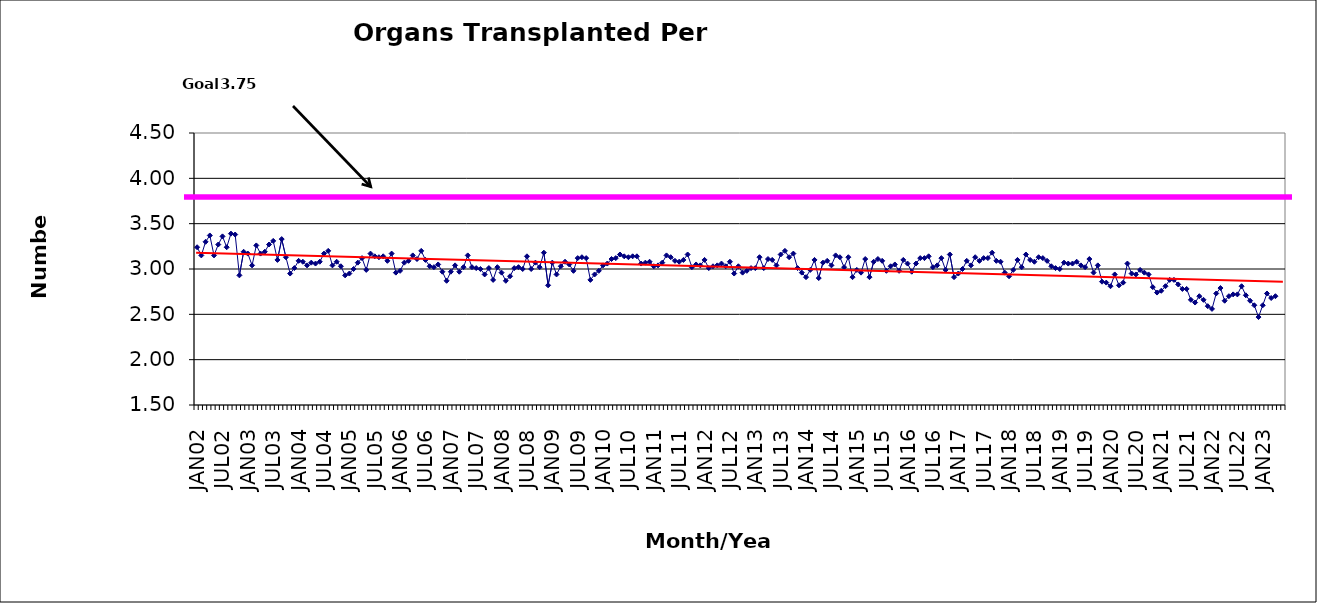
| Category | Series 0 |
|---|---|
| JAN02 | 3.24 |
| FEB02 | 3.15 |
| MAR02 | 3.3 |
| APR02 | 3.37 |
| MAY02 | 3.15 |
| JUN02 | 3.27 |
| JUL02 | 3.36 |
| AUG02 | 3.24 |
| SEP02 | 3.39 |
| OCT02 | 3.38 |
| NOV02 | 2.93 |
| DEC02 | 3.19 |
| JAN03 | 3.17 |
| FEB03 | 3.04 |
| MAR03 | 3.26 |
| APR03 | 3.17 |
| MAY03 | 3.19 |
| JUN03 | 3.27 |
| JUL03 | 3.31 |
| AUG03 | 3.1 |
| SEP03 | 3.33 |
| OCT03 | 3.13 |
| NOV03 | 2.95 |
| DEC03 | 3.01 |
| JAN04 | 3.09 |
| FEB04 | 3.08 |
| MAR04 | 3.04 |
| APR04 | 3.07 |
| MAY04 | 3.06 |
| JUN04 | 3.08 |
| JUL04 | 3.17 |
| AUG04 | 3.2 |
| SEP04 | 3.04 |
| OCT04 | 3.08 |
| NOV04 | 3.03 |
| DEC04 | 2.93 |
| JAN05 | 2.95 |
| FEB05 | 3 |
| MAR05 | 3.07 |
| APR05 | 3.12 |
| MAY05 | 2.99 |
| JUN05 | 3.17 |
| JUL05 | 3.14 |
| AUG05 | 3.13 |
| SEP05 | 3.14 |
| OCT05 | 3.09 |
| NOV05 | 3.17 |
| DEC05 | 2.96 |
| JAN06 | 2.98 |
| FEB06 | 3.07 |
| MAR06 | 3.09 |
| APR06 | 3.15 |
| MAY06 | 3.11 |
| JUN06 | 3.2 |
| JUL06 | 3.1 |
| AUG06 | 3.03 |
| SEP06 | 3.02 |
| OCT06 | 3.05 |
| NOV06 | 2.97 |
| DEC06 | 2.87 |
| JAN07 | 2.97 |
| FEB07 | 3.04 |
| MAR07 | 2.97 |
| APR07 | 3.02 |
| MAY07 | 3.15 |
| JUN07 | 3.02 |
| JUL07 | 3.01 |
| AUG07 | 3 |
| SEP07 | 2.94 |
| OCT07 | 3.01 |
| NOV07 | 2.88 |
| DEC07 | 3.02 |
| JAN08 | 2.96 |
| FEB08 | 2.87 |
| MAR08 | 2.92 |
| APR08 | 3.01 |
| MAY08 | 3.02 |
| JUN08 | 3 |
| JUL08 | 3.14 |
| AUG08 | 3 |
| SEP08 | 3.07 |
| OCT08 | 3.02 |
| NOV08 | 3.18 |
| DEC08 | 2.82 |
| JAN09 | 3.07 |
| FEB09 | 2.94 |
| MAR09 | 3.03 |
| APR09 | 3.08 |
| MAY09 | 3.05 |
| JUN09 | 2.98 |
| JUL09 | 3.12 |
| AUG09 | 3.13 |
| SEP09 | 3.12 |
| OCT09 | 2.88 |
| NOV09 | 2.94 |
| DEC09 | 2.98 |
| JAN10 | 3.04 |
| FEB10 | 3.06 |
| MAR10 | 3.11 |
| APR10 | 3.12 |
| MAY10 | 3.16 |
| JUN10 | 3.14 |
| JUL10 | 3.13 |
| AUG10 | 3.14 |
| SEP10 | 3.14 |
| OCT10 | 3.06 |
| NOV10 | 3.07 |
| DEC10 | 3.08 |
| JAN11 | 3.03 |
| FEB11 | 3.04 |
| MAR11 | 3.07 |
| APR11 | 3.15 |
| MAY11 | 3.13 |
| JUN11 | 3.09 |
| JUL11 | 3.08 |
| AUG11 | 3.1 |
| SEP11 | 3.16 |
| OCT11 | 3.02 |
| NOV11 | 3.05 |
| DEC11 | 3.04 |
| JAN12 | 3.1 |
| FEB12 | 3.01 |
| MAR12 | 3.03 |
| APR12 | 3.04 |
| MAY12 | 3.06 |
| JUN12 | 3.03 |
| JUL12 | 3.08 |
| AUG12 | 2.95 |
| SEP12 | 3.03 |
| OCT12 | 2.96 |
| NOV12 | 2.98 |
| DEC12 | 3.01 |
| JAN13 | 3.01 |
| FEB13 | 3.13 |
| MAR13 | 3.01 |
| APR13 | 3.11 |
| MAY13 | 3.1 |
| JUN13 | 3.04 |
| JUL13 | 3.16 |
| AUG13 | 3.2 |
| SEP13 | 3.13 |
| OCT13 | 3.17 |
| NOV13 | 3.01 |
| DEC13 | 2.96 |
| JAN14 | 2.91 |
| FEB14 | 2.99 |
| MAR14 | 3.1 |
| APR14 | 2.9 |
| MAY14 | 3.07 |
| JUN14 | 3.09 |
| JUL14 | 3.04 |
| AUG14 | 3.15 |
| SEP14 | 3.13 |
| OCT14 | 3.02 |
| NOV14 | 3.13 |
| DEC14 | 2.91 |
| JAN15 | 2.99 |
| FEB15 | 2.96 |
| MAR15 | 3.11 |
| APR15 | 2.91 |
| MAY15 | 3.08 |
| JUN15 | 3.11 |
| JUL15 | 3.09 |
| AUG15 | 2.98 |
| SEP15 | 3.03 |
| OCT15 | 3.05 |
| NOV15 | 2.98 |
| DEC15 | 3.1 |
| JAN16 | 3.06 |
| FEB16 | 2.97 |
| MAR16 | 3.06 |
| APR16 | 3.12 |
| MAY16 | 3.12 |
| JUN16 | 3.14 |
| JUL16 | 3.02 |
| AUG16 | 3.04 |
| SEP16 | 3.12 |
| OCT16 | 2.99 |
| NOV16 | 3.16 |
| DEC16 | 2.91 |
| JAN17 | 2.95 |
| FEB17 | 3 |
| MAR17 | 3.09 |
| APR17 | 3.04 |
| MAY17 | 3.13 |
| JUN17 | 3.09 |
| JUL17 | 3.12 |
| AUG17 | 3.12 |
| SEP17 | 3.18 |
| OCT17 | 3.09 |
| NOV17 | 3.08 |
| DEC17 | 2.96 |
| JAN18 | 2.92 |
| FEB18 | 2.99 |
| MAR18 | 3.1 |
| APR18 | 3.02 |
| MAY18 | 3.16 |
| JUN18 | 3.1 |
| JUL18 | 3.08 |
| AUG18 | 3.13 |
| SEP18 | 3.12 |
| OCT18 | 3.09 |
| NOV18 | 3.03 |
| DEC18 | 3.01 |
| JAN19 | 3 |
| FEB19 | 3.07 |
| MAR19 | 3.06 |
| APR19 | 3.06 |
| MAY19 | 3.08 |
| JUN19 | 3.04 |
| JUL19 | 3.02 |
| AUG19 | 3.11 |
| SEP19 | 2.96 |
| OCT19 | 3.04 |
| NOV19 | 2.86 |
| DEC19 | 2.85 |
| JAN20 | 2.81 |
| FEB20 | 2.94 |
| MAR20 | 2.82 |
| APR20 | 2.85 |
| MAY20 | 3.06 |
| JUN20 | 2.95 |
| JUL20 | 2.94 |
| AUG20 | 2.99 |
| SEP20 | 2.96 |
| OCT20 | 2.94 |
| NOV20 | 2.8 |
| DEC20 | 2.74 |
| JAN21 | 2.76 |
| FEB21 | 2.81 |
| MAR21 | 2.88 |
| APR21 | 2.88 |
| MAY21 | 2.83 |
| JUN21 | 2.78 |
| JUL21 | 2.78 |
| AUG21 | 2.66 |
| SEP21 | 2.63 |
| OCT21 | 2.7 |
| NOV21 | 2.66 |
| DEC21 | 2.59 |
| JAN22 | 2.56 |
| FEB22 | 2.73 |
| MAR22 | 2.79 |
| APR22 | 2.65 |
| MAY22 | 2.7 |
| JUN22 | 2.72 |
| JUL22 | 2.72 |
| AUG22 | 2.81 |
| SEP22 | 2.71 |
| OCT22 | 2.65 |
| NOV22 | 2.6 |
| DEC22 | 2.47 |
| JAN23 | 2.6 |
| FEB23 | 2.73 |
| MAR23 | 2.68 |
| APR23 | 2.7 |